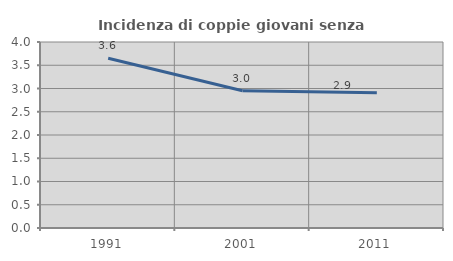
| Category | Incidenza di coppie giovani senza figli |
|---|---|
| 1991.0 | 3.649 |
| 2001.0 | 2.95 |
| 2011.0 | 2.906 |